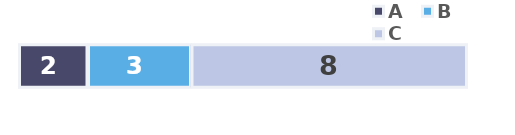
| Category | A | B | C |
|---|---|---|---|
| 0 | 2 | 3 | 8 |